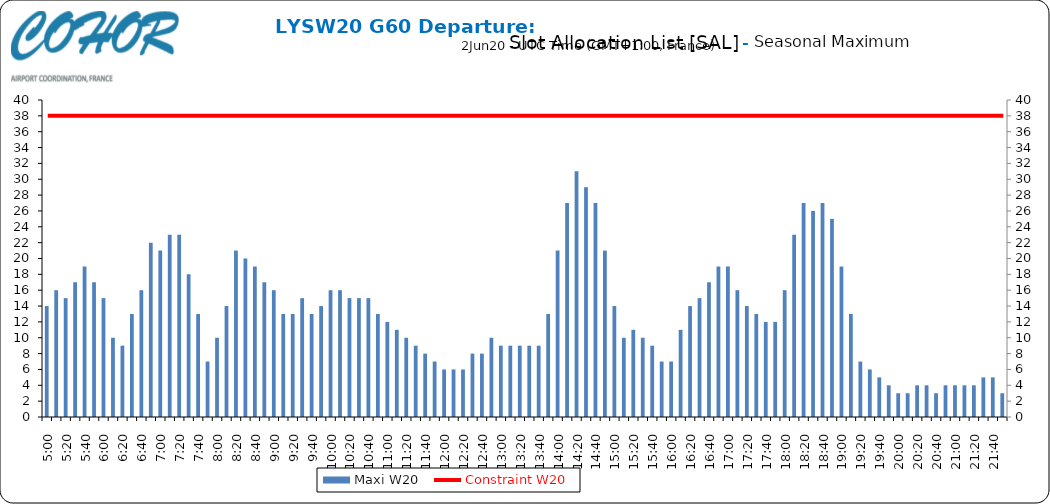
| Category | Maxi W20 |
|---|---|
| 0.20833333333333334 | 14 |
| 0.2152777777777778 | 16 |
| 0.2222222222222222 | 15 |
| 0.22916666666666666 | 17 |
| 0.23611111111111113 | 19 |
| 0.24305555555555555 | 17 |
| 0.25 | 15 |
| 0.2569444444444445 | 10 |
| 0.2638888888888889 | 9 |
| 0.2708333333333333 | 13 |
| 0.2777777777777778 | 16 |
| 0.2847222222222222 | 22 |
| 0.2916666666666667 | 21 |
| 0.2986111111111111 | 23 |
| 0.3055555555555555 | 23 |
| 0.3125 | 18 |
| 0.3194444444444445 | 13 |
| 0.3263888888888889 | 7 |
| 0.3333333333333333 | 10 |
| 0.34027777777777773 | 14 |
| 0.34722222222222227 | 21 |
| 0.3541666666666667 | 20 |
| 0.3611111111111111 | 19 |
| 0.3680555555555556 | 17 |
| 0.375 | 16 |
| 0.3819444444444444 | 13 |
| 0.3888888888888889 | 13 |
| 0.3958333333333333 | 15 |
| 0.40277777777777773 | 13 |
| 0.40972222222222227 | 14 |
| 0.4166666666666667 | 16 |
| 0.4236111111111111 | 16 |
| 0.4305555555555556 | 15 |
| 0.4375 | 15 |
| 0.4444444444444444 | 15 |
| 0.4513888888888889 | 13 |
| 0.4583333333333333 | 12 |
| 0.46527777777777773 | 11 |
| 0.47222222222222227 | 10 |
| 0.4791666666666667 | 9 |
| 0.4861111111111111 | 8 |
| 0.4930555555555556 | 7 |
| 0.5 | 6 |
| 0.5069444444444444 | 6 |
| 0.513888888888889 | 6 |
| 0.5208333333333334 | 8 |
| 0.5277777777777778 | 8 |
| 0.5347222222222222 | 10 |
| 0.5416666666666666 | 9 |
| 0.548611111111111 | 9 |
| 0.5555555555555556 | 9 |
| 0.5625 | 9 |
| 0.5694444444444444 | 9 |
| 0.576388888888889 | 13 |
| 0.5833333333333334 | 21 |
| 0.5902777777777778 | 27 |
| 0.5972222222222222 | 31 |
| 0.6041666666666666 | 29 |
| 0.611111111111111 | 27 |
| 0.6180555555555556 | 21 |
| 0.625 | 14 |
| 0.6319444444444444 | 10 |
| 0.638888888888889 | 11 |
| 0.6458333333333334 | 10 |
| 0.6527777777777778 | 9 |
| 0.6597222222222222 | 7 |
| 0.6666666666666666 | 7 |
| 0.6736111111111112 | 11 |
| 0.6805555555555555 | 14 |
| 0.6875 | 15 |
| 0.6944444444444445 | 17 |
| 0.7013888888888888 | 19 |
| 0.7083333333333334 | 19 |
| 0.7152777777777778 | 16 |
| 0.7222222222222222 | 14 |
| 0.7291666666666666 | 13 |
| 0.7361111111111112 | 12 |
| 0.7430555555555555 | 12 |
| 0.75 | 16 |
| 0.7569444444444445 | 23 |
| 0.7638888888888888 | 27 |
| 0.7708333333333334 | 26 |
| 0.7777777777777778 | 27 |
| 0.7847222222222222 | 25 |
| 0.7916666666666666 | 19 |
| 0.7986111111111112 | 13 |
| 0.8055555555555555 | 7 |
| 0.8125 | 6 |
| 0.8194444444444445 | 5 |
| 0.8263888888888888 | 4 |
| 0.8333333333333334 | 3 |
| 0.8402777777777778 | 3 |
| 0.8472222222222222 | 4 |
| 0.8541666666666666 | 4 |
| 0.8611111111111112 | 3 |
| 0.8680555555555555 | 4 |
| 0.875 | 4 |
| 0.8819444444444445 | 4 |
| 0.8888888888888888 | 4 |
| 0.8958333333333334 | 5 |
| 0.9027777777777778 | 5 |
| 0.9097222222222222 | 3 |